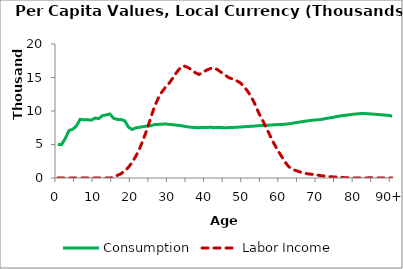
| Category | Consumption | Labor Income |
|---|---|---|
| 0 | 5017.122 | 0 |
|  | 4987.993 | 0 |
| 2 | 5913.813 | 0 |
| 3 | 7083.451 | 0 |
| 4 | 7272.606 | 0 |
| 5 | 7770.148 | 0 |
| 6 | 8758.717 | 0 |
| 7 | 8687.404 | 0 |
| 8 | 8705.459 | 0 |
| 9 | 8630.663 | 0 |
| 10 | 8946.696 | 0 |
| 11 | 8861.443 | 0 |
| 12 | 9303.328 | 0 |
| 13 | 9419.119 | 0 |
| 14 | 9549.748 | 0 |
| 15 | 8918.811 | 51.48 |
| 16 | 8740.721 | 378.674 |
| 17 | 8728.734 | 641.034 |
| 18 | 8539.434 | 1048.418 |
| 19 | 7597.121 | 1584.345 |
| 20 | 7244.543 | 2321.86 |
| 21 | 7479.138 | 3256.017 |
| 22 | 7569.719 | 4374.922 |
| 23 | 7676.955 | 5744.594 |
| 24 | 7755.933 | 7239.703 |
| 25 | 7819.167 | 8980.998 |
| 26 | 7967.401 | 10622.616 |
| 27 | 7998.51 | 11889.456 |
| 28 | 8026.254 | 12830.517 |
| 29 | 8069.071 | 13577.579 |
| 30 | 7999.9 | 14171.273 |
| 31 | 7959.093 | 14975.26 |
| 32 | 7883.868 | 15778.276 |
| 33 | 7813.347 | 16469.364 |
| 34 | 7732.341 | 16717.879 |
| 35 | 7629.621 | 16499.996 |
| 36 | 7565.28 | 16182.209 |
| 37 | 7526.783 | 15721.451 |
| 38 | 7515.609 | 15452.257 |
| 39 | 7527.3 | 15722.465 |
| 40 | 7545.636 | 16096.811 |
| 41 | 7560.242 | 16321.08 |
| 42 | 7551.799 | 16432.947 |
| 43 | 7539.547 | 16164.877 |
| 44 | 7539.071 | 15768.682 |
| 45 | 7484.664 | 15370.033 |
| 46 | 7522.097 | 14984.144 |
| 47 | 7546.073 | 14788.629 |
| 48 | 7567.924 | 14560.332 |
| 49 | 7605.761 | 14246.694 |
| 50 | 7645.852 | 13736.765 |
| 51 | 7684.08 | 13030.227 |
| 52 | 7714.492 | 12178.959 |
| 53 | 7753.509 | 11100.1 |
| 54 | 7807.884 | 9816.358 |
| 55 | 7839.813 | 8728.426 |
| 56 | 7867.299 | 7632.319 |
| 57 | 7895.323 | 6471.449 |
| 58 | 7934.353 | 5331.765 |
| 59 | 7961.724 | 4333.864 |
| 60 | 7985.315 | 3426.105 |
| 61 | 8017.387 | 2522.246 |
| 62 | 8076.946 | 1781.879 |
| 63 | 8156.334 | 1344.377 |
| 64 | 8256.506 | 1116.496 |
| 65 | 8341.056 | 943.333 |
| 66 | 8423.194 | 776.5 |
| 67 | 8512.166 | 646.068 |
| 68 | 8591.802 | 572.197 |
| 69 | 8647.386 | 513.896 |
| 70 | 8684.691 | 435.16 |
| 71 | 8758.339 | 330.736 |
| 72 | 8856.022 | 270.602 |
| 73 | 8952.034 | 206.167 |
| 74 | 9044.682 | 163.7 |
| 75 | 9164.461 | 147.725 |
| 76 | 9257.582 | 143.098 |
| 77 | 9332.987 | 39.624 |
| 78 | 9401.224 | 32.921 |
| 79 | 9476.569 | 19.905 |
| 80 | 9540.496 | 15.87 |
| 81 | 9595.299 | 12.328 |
| 82 | 9642.457 | 9.624 |
| 83 | 9611.643 | 7.361 |
| 84 | 9570.621 | 33.626 |
| 85 | 9528.488 | 2.7 |
| 86 | 9484.532 | 0.387 |
| 87 | 9439.635 | 0 |
| 88 | 9390.696 | 0 |
| 89 | 9350.651 | 0 |
| 90+ | 9235.727 | 0 |